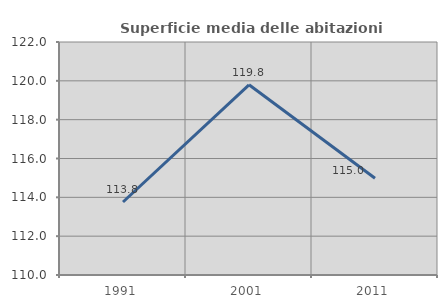
| Category | Superficie media delle abitazioni occupate |
|---|---|
| 1991.0 | 113.76 |
| 2001.0 | 119.796 |
| 2011.0 | 114.981 |